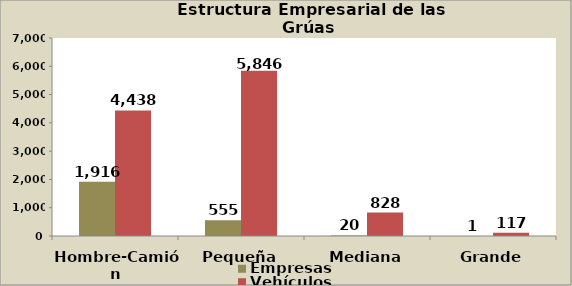
| Category | Empresas | Vehículos |
|---|---|---|
| Hombre-Camión | 1916 | 4438 |
| Pequeña | 555 | 5846 |
| Mediana | 20 | 828 |
| Grande | 1 | 117 |